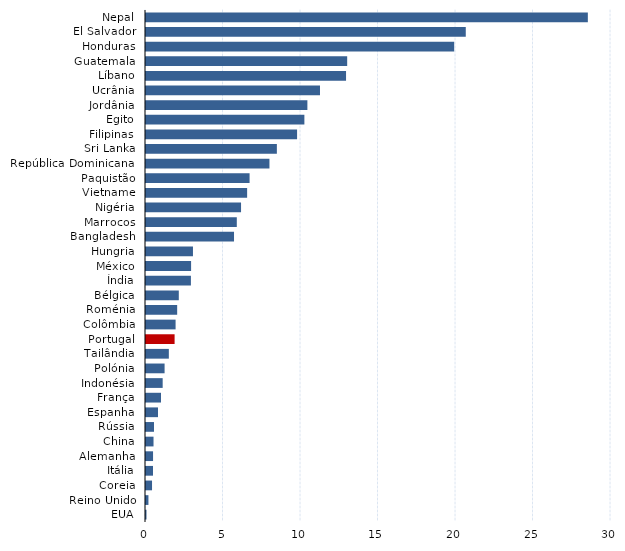
| Category | Series 2 |
|---|---|
| Nepal | 28.506 |
| El Salvador | 20.63 |
| Honduras | 19.882 |
| Guatemala | 12.98 |
| Líbano | 12.906 |
| Ucrânia | 11.225 |
| Jordânia | 10.412 |
| Egito | 10.218 |
| Filipinas | 9.748 |
| Sri Lanka | 8.443 |
| República Dominicana  | 7.965 |
| Paquistão | 6.683 |
| Vietname | 6.525 |
| Nigéria | 6.132 |
| Marrocos | 5.858 |
| Bangladesh | 5.679 |
| Hungria | 3.03 |
| México | 2.909 |
| Índia | 2.897 |
| Bélgica | 2.116 |
| Roménia | 2.011 |
| Colômbia | 1.909 |
| Portugal | 1.845 |
| Tailândia | 1.473 |
| Polónia | 1.199 |
| Indonésia | 1.076 |
| França | 0.969 |
| Espanha | 0.772 |
| Rússia | 0.516 |
| China | 0.485 |
| Alemanha | 0.455 |
| Itália | 0.451 |
| Coreia | 0.39 |
| Reino Unido | 0.157 |
| EUA | 0.032 |